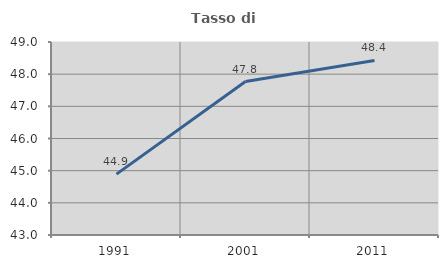
| Category | Tasso di occupazione   |
|---|---|
| 1991.0 | 44.892 |
| 2001.0 | 47.77 |
| 2011.0 | 48.426 |